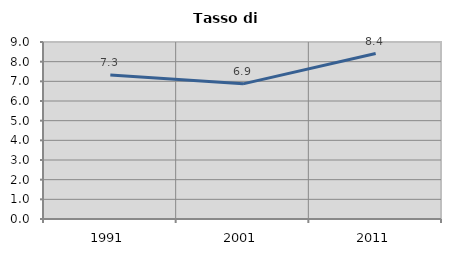
| Category | Tasso di disoccupazione   |
|---|---|
| 1991.0 | 7.323 |
| 2001.0 | 6.872 |
| 2011.0 | 8.411 |